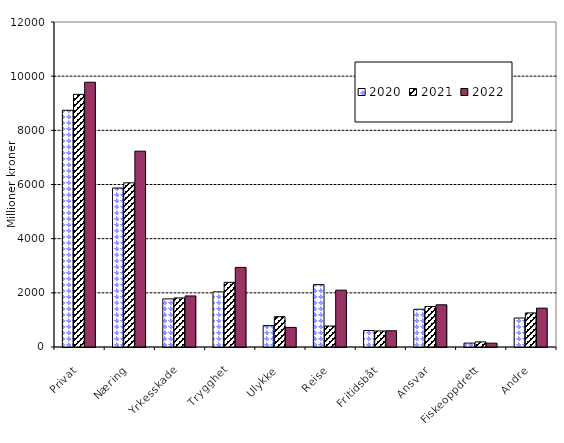
| Category | 2020 | 2021 | 2022 |
|---|---|---|---|
| Privat | 8740.354 | 9329.626 | 9776.708 |
| Næring | 5870.536 | 6062.059 | 7230.909 |
| Yrkesskade | 1776.833 | 1811.924 | 1885.308 |
| Trygghet | 2036.022 | 2387.385 | 2938.864 |
| Ulykke | 790.996 | 1120.298 | 724.487 |
| Reise | 2302.566 | 773.788 | 2098.277 |
| Fritidsbåt | 607.819 | 593.006 | 599.946 |
| Ansvar | 1394.395 | 1493.658 | 1558.65 |
| Fiskeoppdrett | 143.741 | 189.004 | 141.561 |
| Andre | 1069.674 | 1258.06 | 1434.656 |